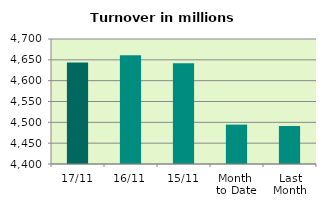
| Category | Series 0 |
|---|---|
| 17/11 | 4643.401 |
| 16/11 | 4661.208 |
| 15/11 | 4641.987 |
| Month 
to Date | 4494.537 |
| Last
Month | 4491.272 |